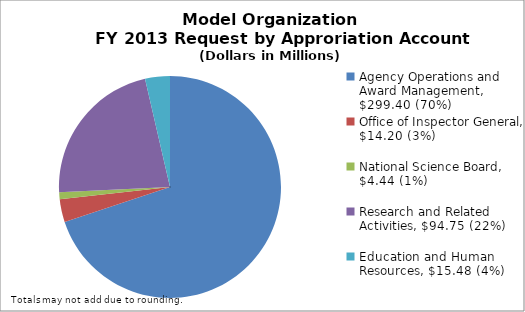
| Category | Series 0 |
|---|---|
| Agency Operations and Award Management, $299.40 (70%) | 299.4 |
| Office of Inspector General, $14.20 (3%) | 14.2 |
| National Science Board, $4.44 (1%) | 4.44 |
| Research and Related Activities, $94.75 (22%) | 94.76 |
| Education and Human Resources, $15.48 (4%) | 15.48 |